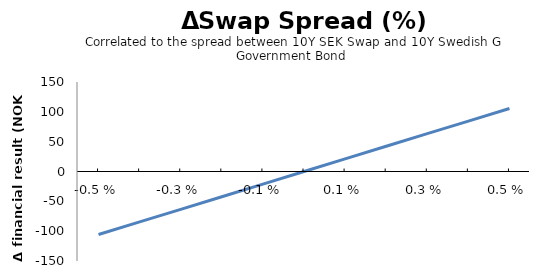
| Category | Series 0 |
|---|---|
| -0.005 | -105.652 |
| -0.004 | -84.521 |
| -0.003 | -63.391 |
| -0.002 | -42.261 |
| -0.001 | -21.13 |
| 0.0 | 0 |
| 0.001 | 21.13 |
| 0.002 | 42.261 |
| 0.003 | 63.391 |
| 0.004 | 84.521 |
| 0.005 | 105.652 |